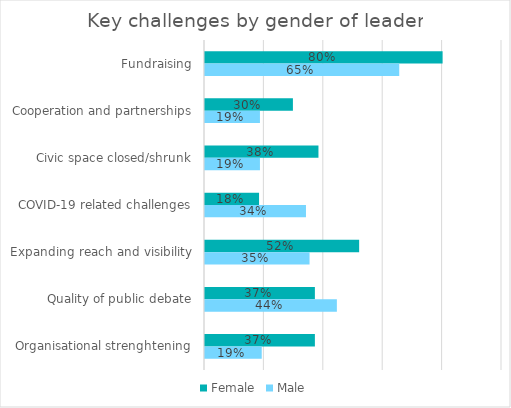
| Category | Under $500k | Over $500k |
|---|---|---|
| Cooperation and partnerships | 35.3 | 10 |
| Quality of public debate | 30.3 | 50.8 |
| Travel restrictions | 23.5 | 6.8 |
| Less visibility in policy space | 26.5 | 6.8 |